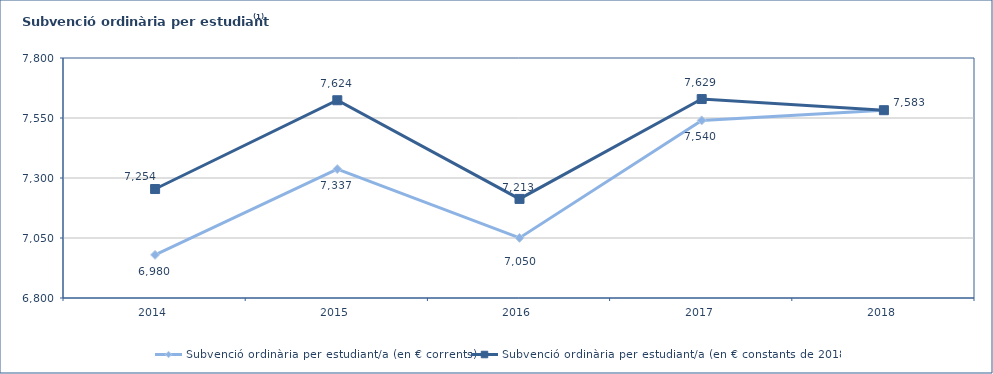
| Category | Subvenció ordinària per estudiant/a (en € corrents) | Subvenció ordinària per estudiant/a (en € constants de 2018) |
|---|---|---|
| 2014.0 | 6979.758 | 7254.065 |
| 2015.0 | 7337.192 | 7624.022 |
| 2016.0 | 7050.463 | 7212.842 |
| 2017.0 | 7540.023 | 7628.995 |
| 2018.0 | 7582.546 | 7582.546 |